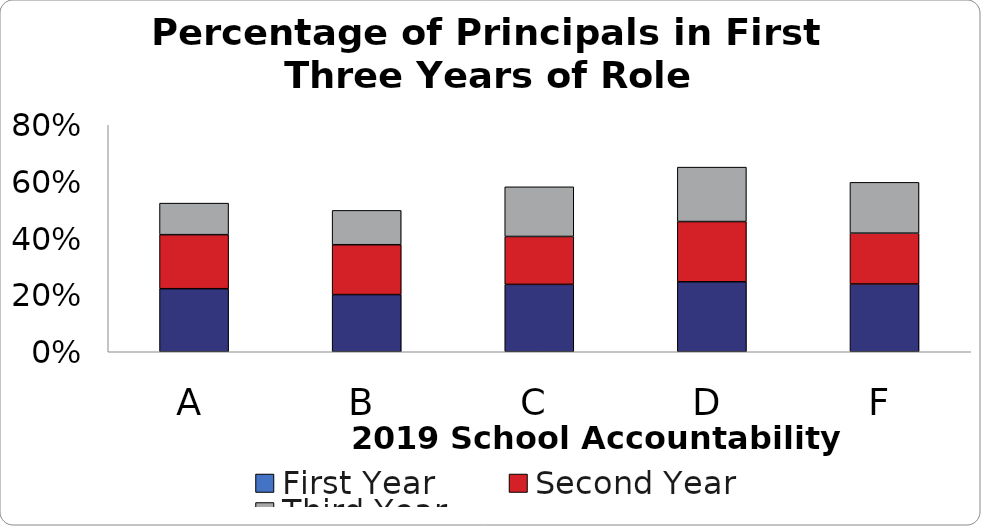
| Category | First Year | Second Year | Third Year |
|---|---|---|---|
| A | 0.222 | 0.19 | 0.111 |
| B | 0.202 | 0.176 | 0.121 |
| C | 0.238 | 0.169 | 0.175 |
| D | 0.247 | 0.212 | 0.192 |
| F | 0.239 | 0.179 | 0.179 |